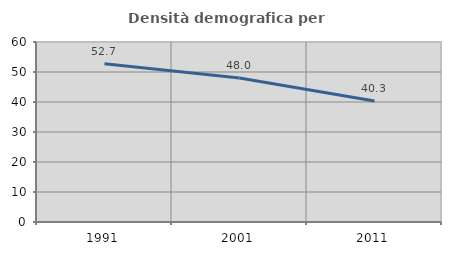
| Category | Densità demografica |
|---|---|
| 1991.0 | 52.717 |
| 2001.0 | 48 |
| 2011.0 | 40.338 |